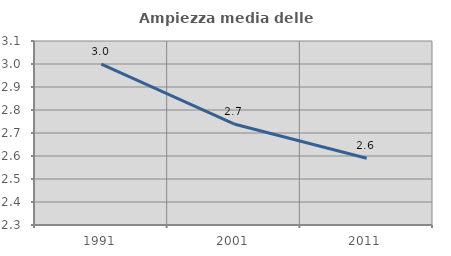
| Category | Ampiezza media delle famiglie |
|---|---|
| 1991.0 | 2.999 |
| 2001.0 | 2.739 |
| 2011.0 | 2.59 |